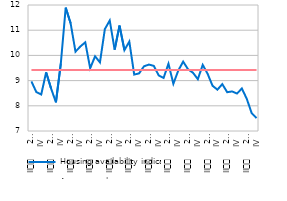
| Category | Housing availability indicator | Average value |
|---|---|---|
| II
     2008 | 8.966 | 9.42 |
| III | 8.544 | 9.42 |
| IV | 8.447 | 9.42 |
| I
2009 | 9.329 | 9.42 |
| II
     2009 | 8.694 | 9.42 |
| III | 8.139 | 9.42 |
| IV
 | 9.67 | 9.42 |
| I
2010 | 11.895 | 9.42 |
| II
     2010 | 11.278 | 9.42 |
| III | 10.149 | 9.42 |
| IV | 10.355 | 9.42 |
| I
2011 | 10.519 | 9.42 |
| II
     2011 | 9.488 | 9.42 |
| III | 9.964 | 9.42 |
| IV | 9.722 | 9.42 |
| I
2012 | 11.044 | 9.42 |
| II
     2012 | 11.386 | 9.42 |
| III | 10.226 | 9.42 |
| IV | 11.184 | 9.42 |
| I
2013 | 10.209 | 9.42 |
| II
     2013 | 10.549 | 9.42 |
| III | 9.239 | 9.42 |
| IV | 9.287 | 9.42 |
| I
2014 | 9.567 | 9.42 |
| II
     2014 | 9.635 | 9.42 |
| III | 9.586 | 9.42 |
| IV | 9.206 | 9.42 |
| I
2015 | 9.106 | 9.42 |
| II
     2015 | 9.669 | 9.42 |
| III | 8.874 | 9.42 |
| IV | 9.396 | 9.42 |
| I
2016 | 9.754 | 9.42 |
| II
     2016 | 9.448 | 9.42 |
| III | 9.313 | 9.42 |
| IV | 9.056 | 9.42 |
| I
2017 | 9.624 | 9.42 |
| II
     2017 | 9.27 | 9.42 |
| III | 8.798 | 9.42 |
| IV | 8.64 | 9.42 |
| I
2018 | 8.86 | 9.42 |
| II
     2018 | 8.539 | 9.42 |
| III | 8.57 | 9.42 |
| IV | 8.487 | 9.42 |
| I
2019. | 8.686 | 9.42 |
| II
     2019 | 8.277 | 9.42 |
| III | 7.711 | 9.42 |
| IV | 7.51 | 9.42 |